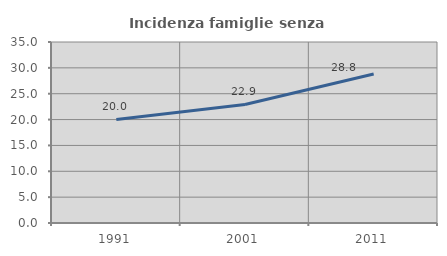
| Category | Incidenza famiglie senza nuclei |
|---|---|
| 1991.0 | 20.025 |
| 2001.0 | 22.921 |
| 2011.0 | 28.805 |